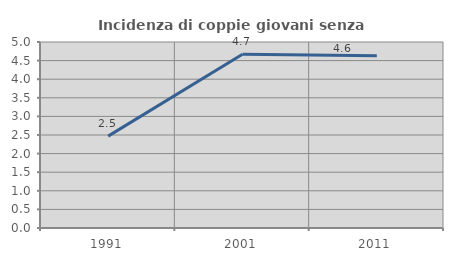
| Category | Incidenza di coppie giovani senza figli |
|---|---|
| 1991.0 | 2.469 |
| 2001.0 | 4.669 |
| 2011.0 | 4.633 |